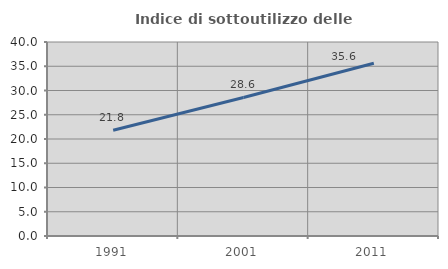
| Category | Indice di sottoutilizzo delle abitazioni  |
|---|---|
| 1991.0 | 21.805 |
| 2001.0 | 28.557 |
| 2011.0 | 35.605 |